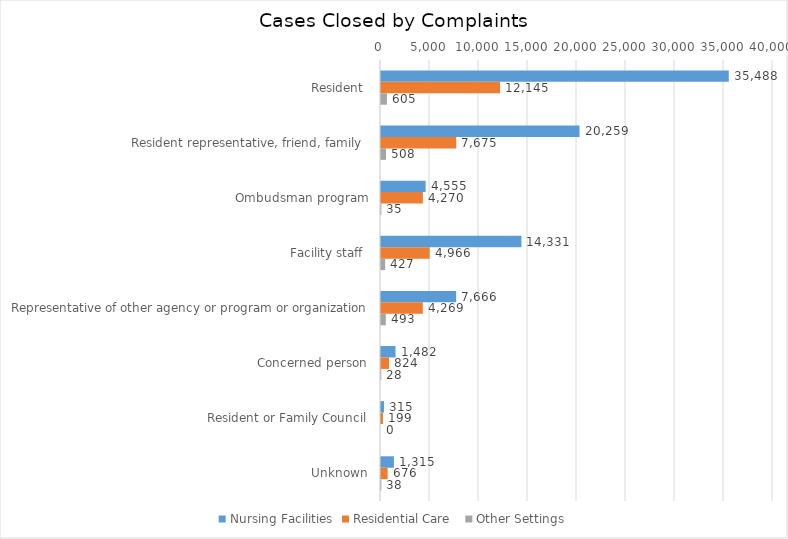
| Category | Nursing Facilities | Residential Care  | Other Settings |
|---|---|---|---|
| Resident  | 35488 | 12145 | 605 |
| Resident representative, friend, family  | 20259 | 7675 | 508 |
| Ombudsman program | 4555 | 4270 | 35 |
| Facility staff  | 14331 | 4966 | 427 |
| Representative of other agency or program or organization | 7666 | 4269 | 493 |
| Concerned person | 1482 | 824 | 28 |
| Resident or Family Council | 315 | 199 | 0 |
| Unknown | 1315 | 676 | 38 |